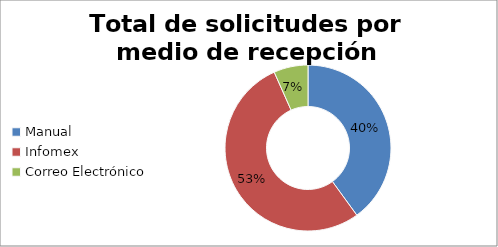
| Category | totales |
|---|---|
| Manual | 6 |
| Infomex | 8 |
| Correo Electrónico | 1 |